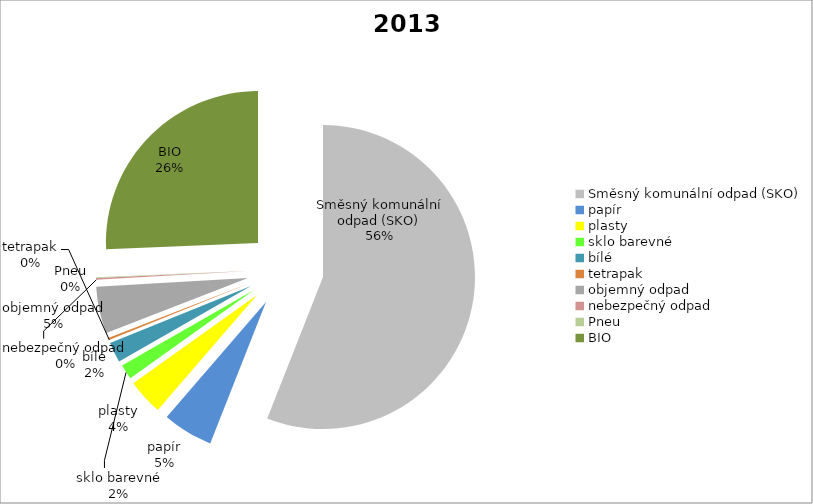
| Category | 2013 |
|---|---|
| Směsný komunální odpad (SKO) | 126.12 |
| papír | 12.04 |
| plasty | 8.56 |
| sklo barevné | 3.62 |
| bílé | 4.87 |
| tetrapak | 0.51 |
| objemný odpad | 11.195 |
| nebezpečný odpad | 0.375 |
| Pneu | 0.176 |
| BIO | 57.82 |